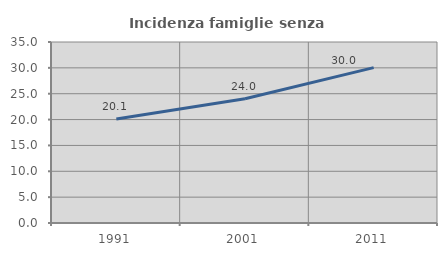
| Category | Incidenza famiglie senza nuclei |
|---|---|
| 1991.0 | 20.127 |
| 2001.0 | 24.04 |
| 2011.0 | 30.045 |